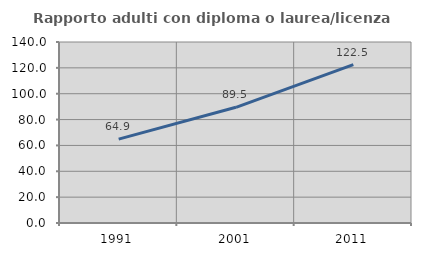
| Category | Rapporto adulti con diploma o laurea/licenza media  |
|---|---|
| 1991.0 | 64.903 |
| 2001.0 | 89.489 |
| 2011.0 | 122.515 |